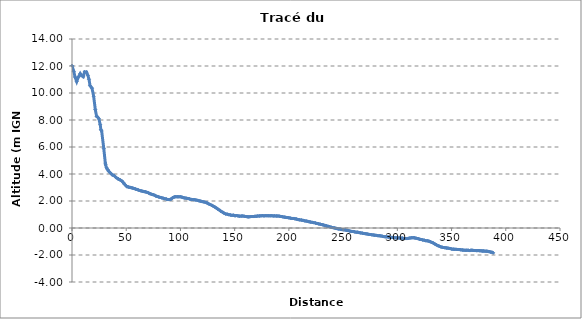
| Category | Series 0 |
|---|---|
| 0.0 | 12.022 |
| 1.6388035272729877 | 11.605 |
| 2.7896173576438645 | 11.185 |
| 4.34099078552273 | 10.846 |
| 5.686233288073736 | 11.148 |
| 7.590093083017217 | 11.439 |
| 8.708045590086694 | 11.294 |
| 10.331832219144957 | 11.205 |
| 11.649083097450909 | 11.567 |
| 13.421205012872338 | 11.554 |
| 14.64587317333892 | 11.31 |
| 15.648989519992762 | 11.017 |
| 16.62483666093979 | 10.544 |
| 18.42924480269425 | 10.358 |
| 19.964863385768922 | 9.764 |
| 21.47670519401518 | 8.774 |
| 22.682984481716282 | 8.271 |
| 23.7168494111339 | 8.21 |
| 24.76314053163753 | 8.094 |
| 26.016118465728056 | 7.654 |
| 26.64962232398002 | 7.277 |
| 27.337120349492068 | 7.188 |
| 29.306063416998477 | 5.888 |
| 30.721648995293332 | 4.81 |
| 31.02225433514671 | 4.679 |
| 31.83909624998163 | 4.461 |
| 32.882807787758324 | 4.324 |
| 33.899210640248015 | 4.205 |
| 34.96099107559128 | 4.108 |
| 36.06554872709119 | 4.029 |
| 37.214056403547694 | 3.929 |
| 38.55870393367258 | 3.897 |
| 39.68898832146375 | 3.815 |
| 40.74180414556625 | 3.736 |
| 42.52233530792798 | 3.634 |
| 42.845097887473486 | 3.64 |
| 44.3429268883114 | 3.564 |
| 46.32530938935475 | 3.461 |
| 47.31992207361534 | 3.355 |
| 48.43936800821793 | 3.248 |
| 49.681205158552416 | 3.143 |
| 50.79856818845475 | 3.057 |
| 52.14182622447048 | 3.035 |
| 53.45523593675618 | 3.01 |
| 54.77062661665222 | 2.982 |
| 56.017703532320496 | 2.959 |
| 57.22716673080417 | 2.924 |
| 58.540751148332106 | 2.889 |
| 59.77870253678625 | 2.857 |
| 61.1031561298444 | 2.818 |
| 62.46668152737973 | 2.776 |
| 63.79618925945044 | 2.747 |
| 65.15500755167078 | 2.721 |
| 66.57885493884717 | 2.694 |
| 67.97668165625389 | 2.677 |
| 69.37775016524257 | 2.634 |
| 70.69624511270115 | 2.593 |
| 71.99203368480732 | 2.541 |
| 73.34295257882063 | 2.498 |
| 74.75026143771036 | 2.468 |
| 76.16229595387804 | 2.425 |
| 77.43131795399881 | 2.364 |
| 78.65514412289149 | 2.336 |
| 79.9894743702047 | 2.302 |
| 81.44632193691706 | 2.262 |
| 82.77702713287353 | 2.239 |
| 84.23145527047137 | 2.201 |
| 85.61276215613121 | 2.172 |
| 87.06991519472078 | 2.143 |
| 88.43389809924341 | 2.107 |
| 89.85050288096704 | 2.104 |
| 91.45343891344497 | 2.149 |
| 93.00886700180364 | 2.253 |
| 94.40322912355701 | 2.301 |
| 95.73456283922192 | 2.315 |
| 97.12677301320906 | 2.313 |
| 98.56404180585672 | 2.312 |
| 100.07187019831744 | 2.315 |
| 101.4405457058682 | 2.28 |
| 102.79258546221317 | 2.246 |
| 104.15847130226027 | 2.221 |
| 105.53394662409008 | 2.203 |
| 106.96569462198154 | 2.183 |
| 108.34604630076662 | 2.154 |
| 109.807987619144 | 2.119 |
| 111.3529022744762 | 2.105 |
| 112.87581866800689 | 2.099 |
| 114.29126650790622 | 2.072 |
| 115.82629632343276 | 2.047 |
| 117.22140728176254 | 2.011 |
| 118.72462549135572 | 1.987 |
| 120.14711267877482 | 1.955 |
| 121.64086767233331 | 1.933 |
| 123.12427236320129 | 1.895 |
| 124.59769257941068 | 1.852 |
| 125.9968644454039 | 1.79 |
| 127.44952827302181 | 1.74 |
| 128.950263102019 | 1.675 |
| 130.39178051192968 | 1.612 |
| 131.83657253229086 | 1.547 |
| 133.3255188181474 | 1.465 |
| 134.71851864185587 | 1.388 |
| 136.12335405821656 | 1.312 |
| 137.49380218775838 | 1.23 |
| 138.89194245913745 | 1.168 |
| 140.35692470969204 | 1.091 |
| 141.8087063799984 | 1.038 |
| 143.26140451614972 | 1.021 |
| 144.6665306215175 | 0.989 |
| 146.1019406616627 | 0.963 |
| 147.54704318943797 | 0.94 |
| 148.91065913829996 | 0.949 |
| 150.30461486595166 | 0.908 |
| 151.73354068608893 | 0.923 |
| 153.1637501399804 | 0.895 |
| 154.63834998197757 | 0.877 |
| 156.0948083703293 | 0.882 |
| 157.51593978106783 | 0.889 |
| 158.9662816892856 | 0.865 |
| 160.40861136513274 | 0.851 |
| 161.7483462483249 | 0.833 |
| 163.08344201085376 | 0.823 |
| 164.48636559915576 | 0.844 |
| 165.94126055299375 | 0.851 |
| 167.3282251177267 | 0.849 |
| 168.6886532435696 | 0.865 |
| 170.0539560142547 | 0.87 |
| 171.3941551194505 | 0.89 |
| 172.8339325773537 | 0.894 |
| 174.236860417076 | 0.901 |
| 175.63448241144792 | 0.917 |
| 177.057408173532 | 0.896 |
| 178.44563224706613 | 0.916 |
| 179.84209723543478 | 0.912 |
| 181.2729614918595 | 0.909 |
| 182.69406167950265 | 0.905 |
| 184.0672790175679 | 0.915 |
| 185.46498708141496 | 0.896 |
| 186.98682263711893 | 0.899 |
| 188.4172360616572 | 0.892 |
| 189.9052015819975 | 0.886 |
| 191.31763390259135 | 0.875 |
| 192.74294316023153 | 0.852 |
| 194.20785764277363 | 0.832 |
| 195.65254387321139 | 0.808 |
| 197.01022374538505 | 0.79 |
| 198.43637943995475 | 0.774 |
| 199.9152476124308 | 0.759 |
| 201.37537289903997 | 0.73 |
| 202.84905511466465 | 0.706 |
| 204.26021196807267 | 0.707 |
| 205.71184760531747 | 0.68 |
| 207.16151845817697 | 0.661 |
| 208.6063796729493 | 0.623 |
| 209.99664265216467 | 0.605 |
| 211.53174030438072 | 0.587 |
| 212.96240292602923 | 0.567 |
| 214.41754183144317 | 0.534 |
| 215.8278934641815 | 0.517 |
| 217.2807310028066 | 0.491 |
| 218.66499902872943 | 0.462 |
| 220.08470389879042 | 0.439 |
| 221.54071388615756 | 0.417 |
| 222.9893511385239 | 0.397 |
| 224.52720222996226 | 0.369 |
| 225.95920550859046 | 0.336 |
| 227.45432171085133 | 0.308 |
| 228.83088276079152 | 0.281 |
| 230.1913391293284 | 0.257 |
| 231.5801137946484 | 0.226 |
| 233.06081282359204 | 0.195 |
| 234.58487521842483 | 0.159 |
| 236.04108746146088 | 0.128 |
| 237.48674334642405 | 0.095 |
| 238.90616199018322 | 0.059 |
| 240.37107639040133 | 0.032 |
| 241.8320320638712 | 0.004 |
| 243.2230633801399 | -0.019 |
| 244.64767629015435 | -0.051 |
| 246.12149607312298 | -0.076 |
| 247.5656255708205 | -0.088 |
| 249.02839016069493 | -0.119 |
| 250.47183842693877 | -0.132 |
| 251.91614224598433 | -0.145 |
| 253.378180011606 | -0.175 |
| 254.82415349626038 | -0.191 |
| 256.22815803497997 | -0.229 |
| 257.6693612077363 | -0.253 |
| 259.1180341564242 | -0.258 |
| 260.557830161155 | -0.283 |
| 262.0052402627613 | -0.311 |
| 263.47306552674354 | -0.312 |
| 264.92342700901935 | -0.343 |
| 266.33236283490504 | -0.364 |
| 267.7399962651719 | -0.383 |
| 269.1905529792052 | -0.406 |
| 270.6203547127765 | -0.423 |
| 272.0002236618699 | -0.438 |
| 273.40480194745896 | -0.467 |
| 274.86410367282895 | -0.482 |
| 276.28169487913846 | -0.497 |
| 277.7546746412254 | -0.518 |
| 279.14294930771246 | -0.534 |
| 280.5405669148239 | -0.546 |
| 281.96598002086125 | -0.567 |
| 283.3676254000706 | -0.574 |
| 284.7728374987874 | -0.586 |
| 286.15005623854694 | -0.612 |
| 287.5616763513209 | -0.637 |
| 289.03171458526106 | -0.651 |
| 290.3829985194325 | -0.655 |
| 291.8167012787181 | -0.676 |
| 293.2167707231663 | -0.686 |
| 294.62503755989655 | -0.696 |
| 296.05104416660777 | -0.705 |
| 297.4607758092138 | -0.713 |
| 298.85811775167923 | -0.728 |
| 300.3025129598776 | -0.737 |
| 301.6955323306195 | -0.738 |
| 303.15696671560465 | -0.751 |
| 304.5535591793942 | -0.745 |
| 305.99168864041457 | -0.777 |
| 307.3561531464048 | -0.781 |
| 308.76965840912237 | -0.782 |
| 310.2135347547868 | -0.767 |
| 311.6798318674367 | -0.74 |
| 313.168913968673 | -0.723 |
| 314.57632593831875 | -0.716 |
| 315.9566586264257 | -0.731 |
| 317.22470487081 | -0.758 |
| 319.34425316469054 | -0.795 |
| 320.6281308198369 | -0.833 |
| 322.02946373408093 | -0.852 |
| 323.4218291601899 | -0.887 |
| 324.7558167305371 | -0.903 |
| 326.17246721615317 | -0.938 |
| 327.58397072702746 | -0.946 |
| 329.05893018722134 | -0.973 |
| 330.45791281816776 | -1.014 |
| 331.7993408145129 | -1.07 |
| 333.1870962993561 | -1.114 |
| 334.5270797408345 | -1.18 |
| 335.9271853753693 | -1.241 |
| 337.3371069095089 | -1.305 |
| 338.6848145708066 | -1.352 |
| 339.95831988258374 | -1.391 |
| 341.3110608599789 | -1.427 |
| 342.602247810947 | -1.444 |
| 343.9460555743416 | -1.461 |
| 345.25833713633955 | -1.479 |
| 346.6472387111742 | -1.491 |
| 347.93287151420026 | -1.512 |
| 349.1399342797198 | -1.527 |
| 350.3940542664133 | -1.566 |
| 351.7747213563733 | -1.566 |
| 353.04726693907014 | -1.582 |
| 354.48627271735245 | -1.583 |
| 355.83358688701526 | -1.592 |
| 357.26907024967693 | -1.598 |
| 358.6193385337698 | -1.615 |
| 360.034136228875 | -1.633 |
| 361.3831232320687 | -1.641 |
| 362.7526169792664 | -1.654 |
| 364.07488558309177 | -1.648 |
| 365.3562881603228 | -1.651 |
| 366.6826876115141 | -1.672 |
| 367.98622266610147 | -1.644 |
| 369.3370102498786 | -1.652 |
| 370.6711228317705 | -1.666 |
| 371.9902788331013 | -1.671 |
| 373.361108956244 | -1.677 |
| 374.6993413461923 | -1.673 |
| 376.0302111658883 | -1.681 |
| 377.2638245007894 | -1.69 |
| 378.4581665918412 | -1.706 |
| 379.5385698714781 | -1.702 |
| 380.8126422234435 | -1.716 |
| 382.11000562702606 | -1.717 |
| 383.42148542066946 | -1.729 |
| 384.7151301056064 | -1.754 |
| 385.9714197254238 | -1.783 |
| 387.1969775323693 | -1.793 |
| 388.41723538018226 | -1.841 |